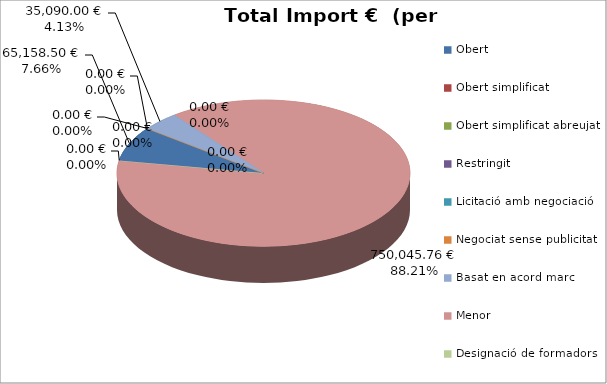
| Category | Total preu              (amb iva) |
|---|---|
| Obert | 65158.5 |
| Obert simplificat | 0 |
| Obert simplificat abreujat | 0 |
| Restringit | 0 |
| Licitació amb negociació | 0 |
| Negociat sense publicitat | 0 |
| Basat en acord marc | 35090 |
| Menor | 750045.759 |
| Designació de formadors | 0 |